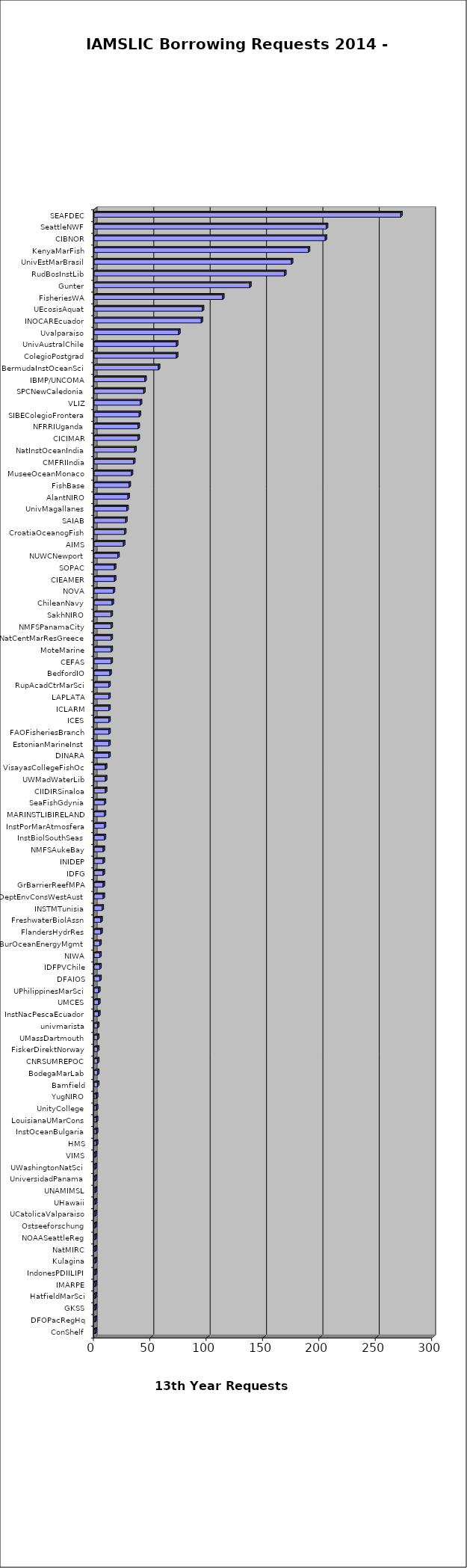
| Category | Series 0 |
|---|---|
| ConShelf | 1 |
| DFOPacRegHq | 1 |
| GKSS | 1 |
| HatfieldMarSci | 1 |
| IMARPE | 1 |
| IndonesPDIILIPI | 1 |
| Kulagina | 1 |
| NatMIRC | 1 |
| NOAASeattleReg | 1 |
| Ostseeforschung | 1 |
| UCatolicaValparaiso | 1 |
| UHawaii | 1 |
| UNAMIMSL | 1 |
| UniversidadPanama | 1 |
| UWashingtonNatSci | 1 |
| VIMS | 1 |
| HMS | 2 |
| InstOceanBulgaria | 2 |
| LouisianaUMarCons | 2 |
| UnityCollege | 2 |
| YugNIRO | 2 |
| Bamfield | 3 |
| BodegaMarLab | 3 |
| CNRSUMREPOC | 3 |
| FiskerDirektNorway | 3 |
| UMassDartmouth | 3 |
| univmarista | 3 |
| InstNacPescaEcuador | 4 |
| UMCES | 4 |
| UPhilippinesMarSci | 4 |
| DFAIOS | 5 |
| IDFPVChile | 5 |
| NIWA | 5 |
| USBurOceanEnergyMgmt | 5 |
| FlandersHydrRes | 6 |
| FreshwaterBiolAssn | 6 |
| INSTMTunisia | 7 |
| DeptEnvConsWestAust | 8 |
| GrBarrierReefMPA | 8 |
| IDFG | 8 |
| INIDEP | 8 |
| NMFSAukeBay | 8 |
| InstBiolSouthSeas | 9 |
| InstPorMarAtmosfera | 9 |
| MARINSTLIBIRELAND | 9 |
| SeaFishGdynia | 9 |
| CIIDIRSinaloa | 10 |
| UWMadWaterLib | 10 |
| VisayasCollegeFishOc | 10 |
| DINARA | 13 |
| EstonianMarineInst | 13 |
| FAOFisheriesBranch | 13 |
| ICES | 13 |
| ICLARM | 13 |
| LAPLATA | 13 |
| RupAcadCtrMarSci | 13 |
| BedfordIO | 14 |
| CEFAS | 15 |
| MoteMarine | 15 |
| NatCentMarResGreece | 15 |
| NMFSPanamaCity | 15 |
| SakhNIRO | 15 |
| ChileanNavy | 16 |
| NOVA | 17 |
| CIEAMER | 18 |
| SOPAC | 18 |
| NUWCNewport | 21 |
| AIMS | 26 |
| CroatiaOceanogFish | 27 |
| SAIAB | 28 |
| UnivMagallanes | 29 |
| AlantNIRO | 30 |
| FishBase | 31 |
| MuseeOceanMonaco | 33 |
| CMFRIIndia | 35 |
| NatInstOceanIndia | 36 |
| CICIMAR | 39 |
| NFRRIUganda | 39 |
| SIBEColegioFrontera | 40 |
| VLIZ | 41 |
| SPCNewCaledonia | 44 |
| IBMP/UNCOMA | 45 |
| BermudaInstOceanSci | 57 |
| ColegioPostgrad | 73 |
| UnivAustralChile | 73 |
| Uvalparaiso | 75 |
| INOCAREcuador | 95 |
| UEcosisAquat | 96 |
| FisheriesWA | 114 |
| Gunter | 138 |
| RudBosInstLib | 169 |
| UnivEstMarBrasil | 175 |
| KenyaMarFish | 190 |
| CIBNOR | 205 |
| SeattleNWF | 206 |
| SEAFDEC | 272 |